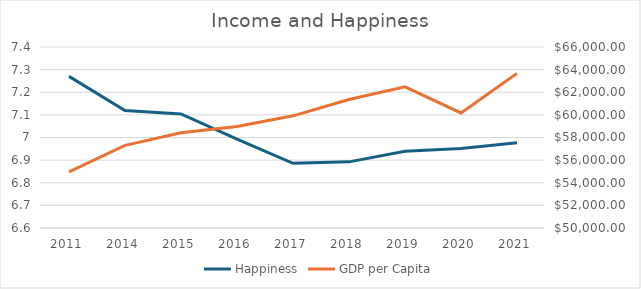
| Category | Happiness |
|---|---|
| 2011.0 | 7.27 |
| 2014.0 | 7.119 |
| 2015.0 | 7.104 |
| 2016.0 | 6.993 |
| 2017.0 | 6.886 |
| 2018.0 | 6.892 |
| 2019.0 | 6.94 |
| 2020.0 | 6.952 |
| 2021.0 | 6.977 |